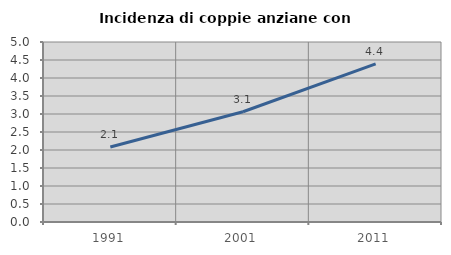
| Category | Incidenza di coppie anziane con figli |
|---|---|
| 1991.0 | 2.082 |
| 2001.0 | 3.063 |
| 2011.0 | 4.392 |